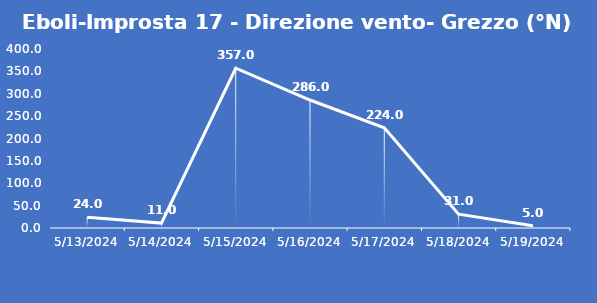
| Category | Eboli-Improsta 17 - Direzione vento- Grezzo (°N) |
|---|---|
| 5/13/24 | 24 |
| 5/14/24 | 11 |
| 5/15/24 | 357 |
| 5/16/24 | 286 |
| 5/17/24 | 224 |
| 5/18/24 | 31 |
| 5/19/24 | 5 |